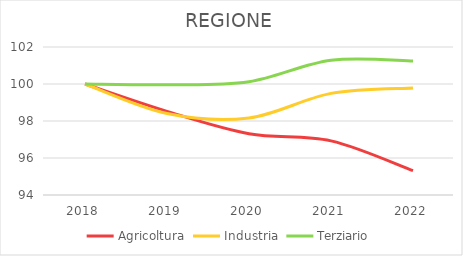
| Category | Agricoltura | Industria | Terziario |
|---|---|---|---|
| 2018.0 | 100 | 100 | 100 |
| 2019.0 | 98.523 | 98.404 | 99.957 |
| 2020.0 | 97.314 | 98.164 | 100.125 |
| 2021.0 | 96.927 | 99.493 | 101.283 |
| 2022.0 | 95.314 | 99.789 | 101.242 |